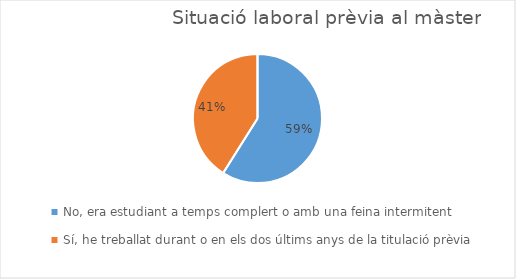
| Category | Series 0 |
|---|---|
| No, era estudiant a temps complert o amb una feina intermitent
 | 56 |
| Sí, he treballat durant o en els dos últims anys de la titulació prèvia | 39 |